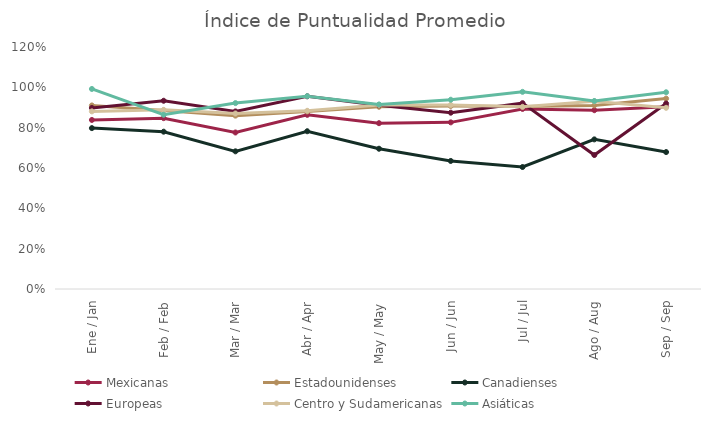
| Category | Mexicanas | Estadounidenses | Canadienses | Europeas | Centro y Sudamericanas | Asiáticas |
|---|---|---|---|---|---|---|
| Ene / Jan | 0.838 | 0.91 | 0.798 | 0.898 | 0.881 | 0.992 |
| Feb / Feb | 0.847 | 0.885 | 0.78 | 0.933 | 0.888 | 0.864 |
| Mar / Mar | 0.776 | 0.86 | 0.683 | 0.881 | 0.87 | 0.922 |
| Abr / Apr | 0.864 | 0.88 | 0.782 | 0.956 | 0.884 | 0.956 |
| May / May | 0.822 | 0.904 | 0.696 | 0.911 | 0.913 | 0.915 |
| Jun / Jun | 0.826 | 0.907 | 0.635 | 0.874 | 0.913 | 0.939 |
| Jul / Jul | 0.893 | 0.905 | 0.605 | 0.922 | 0.903 | 0.978 |
| Ago / Aug | 0.887 | 0.91 | 0.742 | 0.664 | 0.931 | 0.932 |
| Sep / Sep | 0.904 | 0.944 | 0.679 | 0.92 | 0.898 | 0.976 |